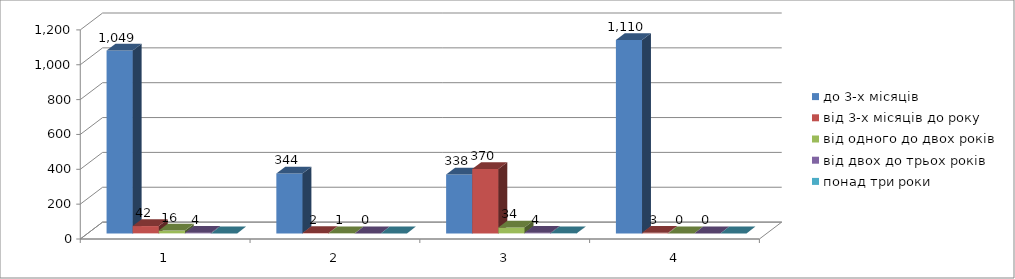
| Category | до 3-х місяців | від 3-х місяців до року | від одного до двох років | від двох до трьох років | понад три роки |
|---|---|---|---|---|---|
| 0 | 1049 | 42 | 16 | 4 | 0 |
| 1 | 344 | 2 | 1 | 0 | 0 |
| 2 | 338 | 370 | 34 | 4 | 1 |
| 3 | 1110 | 3 | 0 | 0 | 0 |